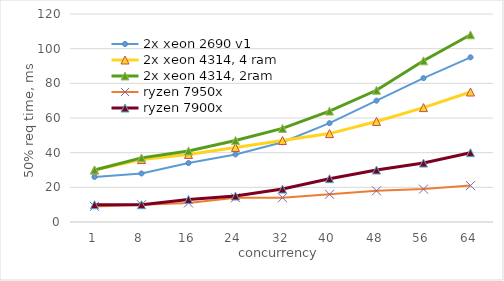
| Category | 2x xeon 2690 v1 | 2x xeon 4314, 4 ram | 2x xeon 4314, 2ram | ryzen 7950x | ryzen 7900x |
|---|---|---|---|---|---|
| 1 | 26 | 30 | 30 | 9 | 10 |
| 8 | 28 | 36 | 37 | 10 | 10 |
| 16 | 34 | 39 | 41 | 11 | 13 |
| 24 | 39 | 43 | 47 | 14 | 15 |
| 32 | 46 | 47 | 54 | 14 | 19 |
| 40 | 57 | 51 | 64 | 16 | 25 |
| 48 | 70 | 58 | 76 | 18 | 30 |
| 56 | 83 | 66 | 93 | 19 | 34 |
| 64 | 95 | 75 | 108 | 21 | 40 |